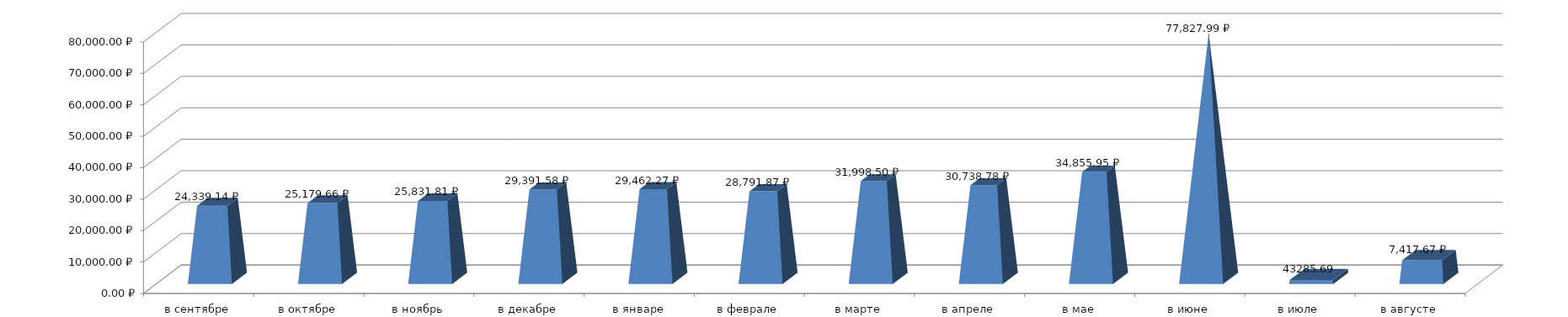
| Category | Series 0 |
|---|---|
| в сентябре | 24339.14 |
| в октябре | 25179.66 |
| в ноябрь | 25831.81 |
| в декабре | 29391.58 |
| в январе | 29462.27 |
| в феврале | 28791.87 |
| в марте | 31998.5 |
| в апреле | 30738.78 |
| в мае | 34855.95 |
| в июне | 77827.99 |
| в июле | 1227.72 |
| в августе | 7417.67 |